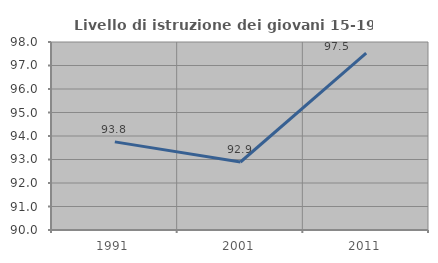
| Category | Livello di istruzione dei giovani 15-19 anni |
|---|---|
| 1991.0 | 93.75 |
| 2001.0 | 92.893 |
| 2011.0 | 97.531 |